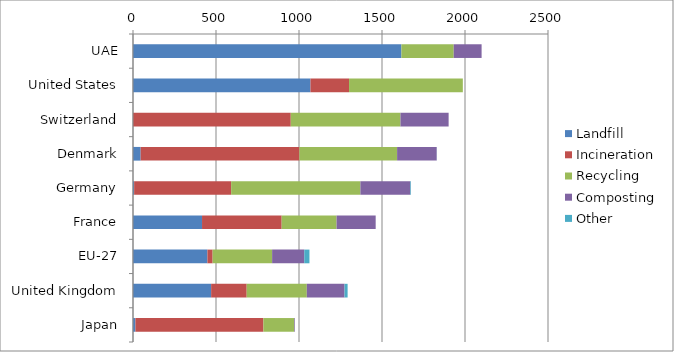
| Category | Landfill | Incineration | Recycling  | Composting | Other |
|---|---|---|---|---|---|
| UAE | 1617 | 0 | 315 | 168 | 0 |
| United States | 1069 | 232.48 | 685.52 | 0 | 0 |
| Switzerland | 0 | 950.41 | 660.82 | 290.14 | 0 |
| Denmark | 46.03 | 956.44 | 588.49 | 238.63 | 0.55 |
| Germany | 6.85 | 584.38 | 778.63 | 300.82 | 3.84 |
| France | 415.89 | 479.73 | 330.68 | 235.62 | 0 |
| EU-27 | 448.22 | 31.51 | 358.36 | 193.7 | 31.23 |
| United Kingdom | 470.68 | 214.25 | 362.19 | 227.12 | 18.63 |
| Japan | 14.64 | 770.91 | 186.26 | 3.76 | 0 |